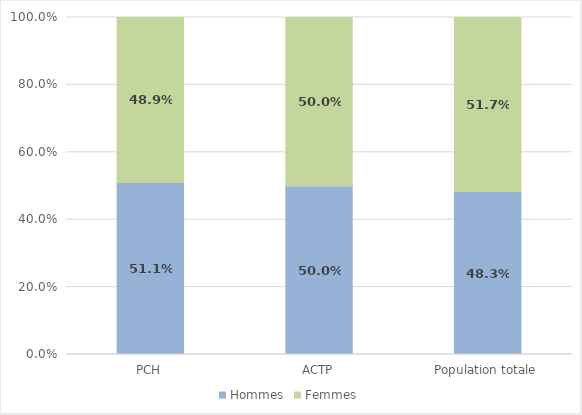
| Category | Hommes | Femmes |
|---|---|---|
| PCH | 0.511 | 0.489 |
| ACTP | 0.5 | 0.5 |
| Population totale | 0.483 | 0.517 |